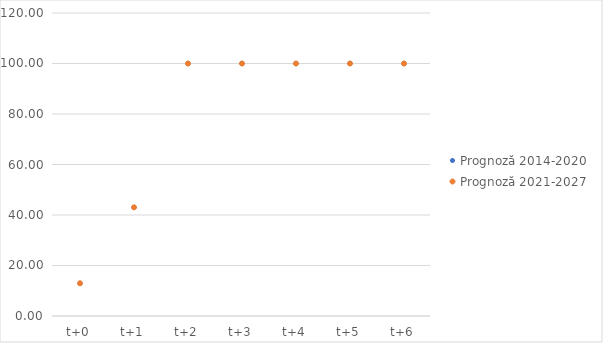
| Category | Prognoză 2014-2020 | Prognoză 2021-2027 |
|---|---|---|
| t+0 | 12.963 | 12.963 |
| t+1 | 43.034 | 43.034 |
| t+2 | 100 | 100 |
| t+3 | 100 | 100 |
| t+4 | 100 | 100 |
| t+5 | 100 | 100 |
| t+6 | 100 | 100 |